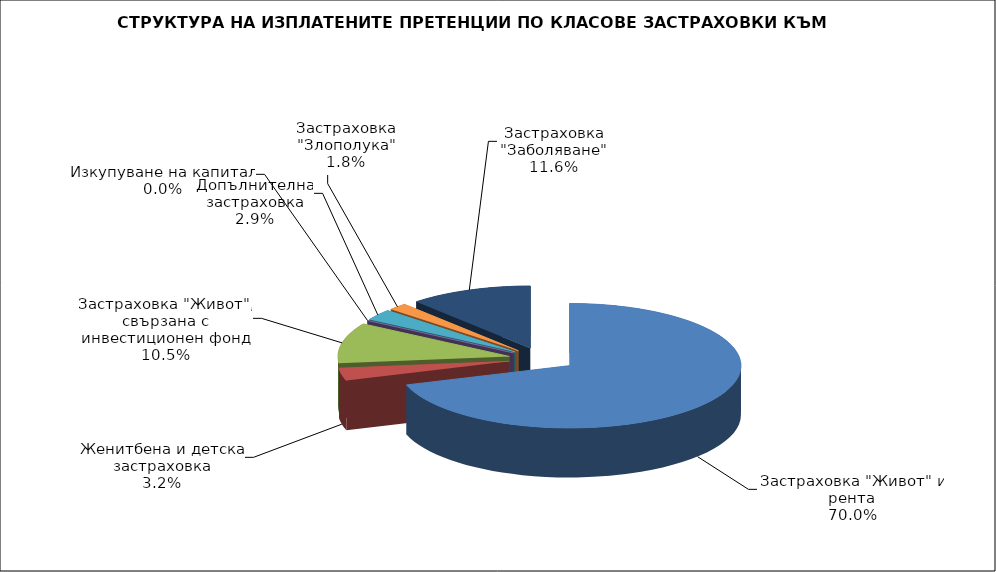
| Category | 45 544 852 |
|---|---|
| Застраховка "Живот" и рента | 45544852.13 |
| Женитбена и детска застраховка | 2107116.163 |
| Застраховка "Живот", свързана с инвестиционен фонд | 6847720.683 |
| Изкупуване на капитал | 0 |
| Допълнителна застраховка | 1868618.024 |
| Застраховка "Злополука" | 1167309.62 |
| Застраховка "Заболяване" | 7535476.98 |